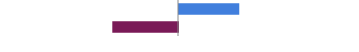
| Category | Series 0 |
|---|---|
| Favorable | 0.34 |
| Unfavorable | -0.371 |